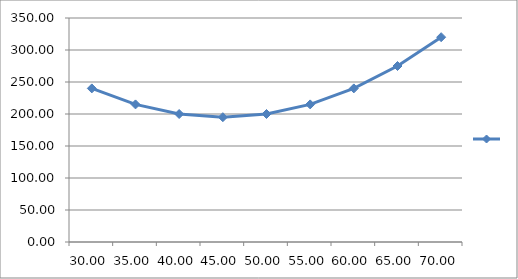
| Category | Series 0 |
|---|---|
| 30.0 | 240 |
| 35.0 | 215 |
| 40.0 | 200 |
| 45.0 | 195 |
| 50.0 | 200 |
| 55.0 | 215 |
| 60.0 | 240 |
| 65.0 | 275 |
| 70.0 | 320 |